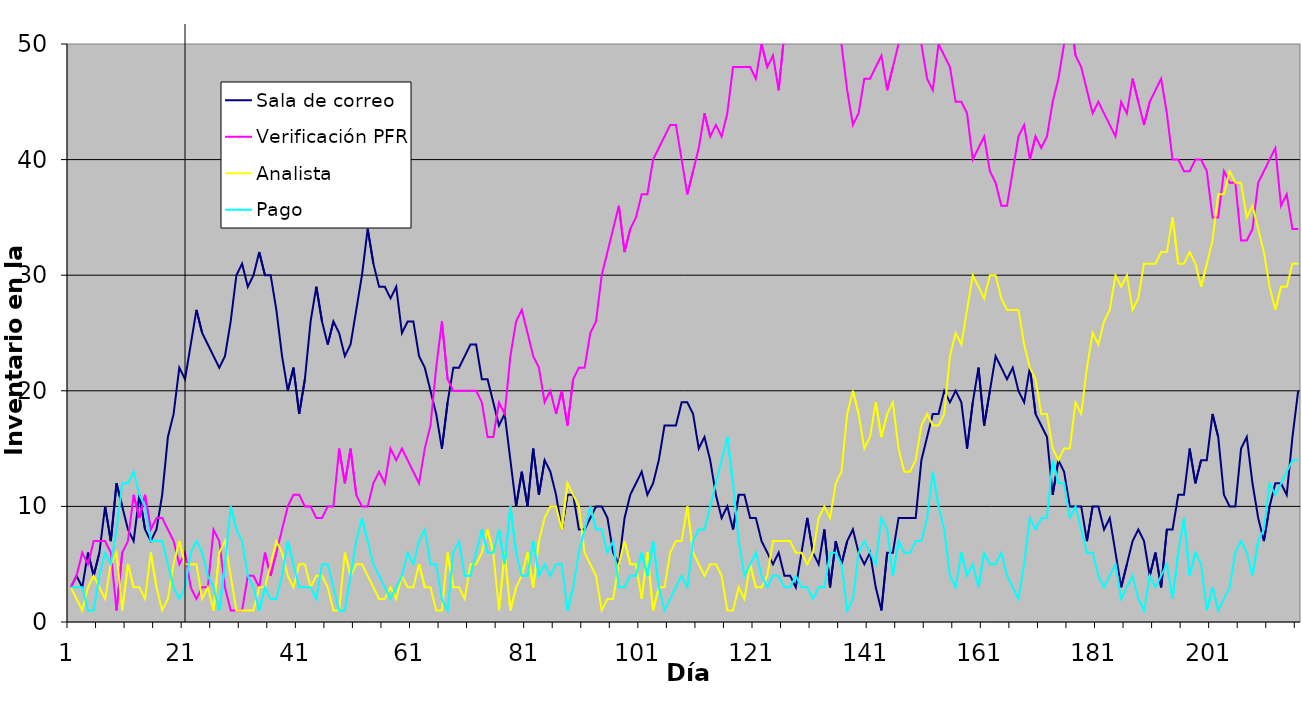
| Category | Sala de correo | Verificación PFR | Analista | Pago |
|---|---|---|---|---|
| 0 | 3 | 3 | 3 | 3 |
| 1 | 4 | 4 | 2 | 3 |
| 2 | 3 | 6 | 1 | 3 |
| 3 | 6 | 5 | 3 | 1 |
| 4 | 4 | 7 | 4 | 1 |
| 5 | 6 | 7 | 3 | 4 |
| 6 | 10 | 7 | 2 | 6 |
| 7 | 7 | 6 | 5 | 5 |
| 8 | 12 | 1 | 6 | 8 |
| 9 | 10 | 6 | 1 | 12 |
| 10 | 8 | 7 | 5 | 12 |
| 11 | 7 | 11 | 3 | 13 |
| 12 | 11 | 9 | 3 | 11 |
| 13 | 8 | 11 | 2 | 10 |
| 14 | 7 | 8 | 6 | 7 |
| 15 | 8 | 9 | 3 | 7 |
| 16 | 11 | 9 | 1 | 7 |
| 17 | 16 | 8 | 2 | 5 |
| 18 | 18 | 7 | 5 | 3 |
| 19 | 22 | 5 | 7 | 2 |
| 20 | 21 | 6 | 5 | 3 |
| 21 | 24 | 3 | 5 | 6 |
| 22 | 27 | 2 | 5 | 7 |
| 23 | 25 | 3 | 2 | 6 |
| 24 | 24 | 3 | 3 | 4 |
| 25 | 23 | 8 | 1 | 3 |
| 26 | 22 | 7 | 6 | 1 |
| 27 | 23 | 3 | 7 | 5 |
| 28 | 26 | 1 | 4 | 10 |
| 29 | 30 | 1 | 1 | 8 |
| 30 | 31 | 1 | 1 | 7 |
| 31 | 29 | 4 | 1 | 4 |
| 32 | 30 | 4 | 1 | 3 |
| 33 | 32 | 3 | 3 | 1 |
| 34 | 30 | 6 | 3 | 3 |
| 35 | 30 | 4 | 5 | 2 |
| 36 | 27 | 6 | 7 | 2 |
| 37 | 23 | 8 | 6 | 4 |
| 38 | 20 | 10 | 4 | 7 |
| 39 | 22 | 11 | 3 | 5 |
| 40 | 18 | 11 | 5 | 3 |
| 41 | 21 | 10 | 5 | 3 |
| 42 | 26 | 10 | 3 | 3 |
| 43 | 29 | 9 | 4 | 2 |
| 44 | 26 | 9 | 4 | 5 |
| 45 | 24 | 10 | 3 | 5 |
| 46 | 26 | 10 | 1 | 3 |
| 47 | 25 | 15 | 1 | 1 |
| 48 | 23 | 12 | 6 | 1 |
| 49 | 24 | 15 | 4 | 4 |
| 50 | 27 | 11 | 5 | 7 |
| 51 | 30 | 10 | 5 | 9 |
| 52 | 34 | 10 | 4 | 7 |
| 53 | 31 | 12 | 3 | 5 |
| 54 | 29 | 13 | 2 | 4 |
| 55 | 29 | 12 | 2 | 3 |
| 56 | 28 | 15 | 3 | 2 |
| 57 | 29 | 14 | 2 | 3 |
| 58 | 25 | 15 | 4 | 4 |
| 59 | 26 | 14 | 3 | 6 |
| 60 | 26 | 13 | 3 | 5 |
| 61 | 23 | 12 | 5 | 7 |
| 62 | 22 | 15 | 3 | 8 |
| 63 | 20 | 17 | 3 | 5 |
| 64 | 18 | 22 | 1 | 5 |
| 65 | 15 | 26 | 1 | 2 |
| 66 | 19 | 21 | 6 | 1 |
| 67 | 22 | 20 | 3 | 6 |
| 68 | 22 | 20 | 3 | 7 |
| 69 | 23 | 20 | 2 | 4 |
| 70 | 24 | 20 | 5 | 4 |
| 71 | 24 | 20 | 5 | 6 |
| 72 | 21 | 19 | 6 | 8 |
| 73 | 21 | 16 | 8 | 6 |
| 74 | 19 | 16 | 6 | 6 |
| 75 | 17 | 19 | 1 | 8 |
| 76 | 18 | 18 | 6 | 5 |
| 77 | 14 | 23 | 1 | 10 |
| 78 | 10 | 26 | 3 | 6 |
| 79 | 13 | 27 | 4 | 4 |
| 80 | 10 | 25 | 6 | 4 |
| 81 | 15 | 23 | 3 | 7 |
| 82 | 11 | 22 | 7 | 4 |
| 83 | 14 | 19 | 9 | 5 |
| 84 | 13 | 20 | 10 | 4 |
| 85 | 11 | 18 | 10 | 5 |
| 86 | 8 | 20 | 8 | 5 |
| 87 | 11 | 17 | 12 | 1 |
| 88 | 11 | 21 | 11 | 3 |
| 89 | 8 | 22 | 10 | 6 |
| 90 | 8 | 22 | 6 | 8 |
| 91 | 9 | 25 | 5 | 10 |
| 92 | 10 | 26 | 4 | 8 |
| 93 | 10 | 30 | 1 | 8 |
| 94 | 9 | 32 | 2 | 6 |
| 95 | 6 | 34 | 2 | 7 |
| 96 | 5 | 36 | 5 | 3 |
| 97 | 9 | 32 | 7 | 3 |
| 98 | 11 | 34 | 5 | 4 |
| 99 | 12 | 35 | 5 | 4 |
| 100 | 13 | 37 | 2 | 6 |
| 101 | 11 | 37 | 6 | 4 |
| 102 | 12 | 40 | 1 | 7 |
| 103 | 14 | 41 | 3 | 3 |
| 104 | 17 | 42 | 3 | 1 |
| 105 | 17 | 43 | 6 | 2 |
| 106 | 17 | 43 | 7 | 3 |
| 107 | 19 | 40 | 7 | 4 |
| 108 | 19 | 37 | 10 | 3 |
| 109 | 18 | 39 | 6 | 7 |
| 110 | 15 | 41 | 5 | 8 |
| 111 | 16 | 44 | 4 | 8 |
| 112 | 14 | 42 | 5 | 10 |
| 113 | 11 | 43 | 5 | 12 |
| 114 | 9 | 42 | 4 | 14 |
| 115 | 10 | 44 | 1 | 16 |
| 116 | 8 | 48 | 1 | 12 |
| 117 | 11 | 48 | 3 | 7 |
| 118 | 11 | 48 | 2 | 4 |
| 119 | 9 | 48 | 5 | 5 |
| 120 | 9 | 47 | 3 | 6 |
| 121 | 7 | 50 | 3 | 4 |
| 122 | 6 | 48 | 4 | 3 |
| 123 | 5 | 49 | 7 | 4 |
| 124 | 6 | 46 | 7 | 4 |
| 125 | 4 | 51 | 7 | 3 |
| 126 | 4 | 52 | 7 | 3 |
| 127 | 3 | 55 | 6 | 4 |
| 128 | 6 | 55 | 6 | 3 |
| 129 | 9 | 55 | 5 | 3 |
| 130 | 6 | 56 | 6 | 2 |
| 131 | 5 | 55 | 9 | 3 |
| 132 | 8 | 53 | 10 | 3 |
| 133 | 3 | 54 | 9 | 6 |
| 134 | 7 | 51 | 12 | 6 |
| 135 | 5 | 50 | 13 | 5 |
| 136 | 7 | 46 | 18 | 1 |
| 137 | 8 | 43 | 20 | 2 |
| 138 | 6 | 44 | 18 | 6 |
| 139 | 5 | 47 | 15 | 7 |
| 140 | 6 | 47 | 16 | 6 |
| 141 | 3 | 48 | 19 | 5 |
| 142 | 1 | 49 | 16 | 9 |
| 143 | 6 | 46 | 18 | 8 |
| 144 | 6 | 48 | 19 | 4 |
| 145 | 9 | 50 | 15 | 7 |
| 146 | 9 | 52 | 13 | 6 |
| 147 | 9 | 54 | 13 | 6 |
| 148 | 9 | 55 | 14 | 7 |
| 149 | 14 | 50 | 17 | 7 |
| 150 | 16 | 47 | 18 | 9 |
| 151 | 18 | 46 | 17 | 13 |
| 152 | 18 | 50 | 17 | 10 |
| 153 | 20 | 49 | 18 | 8 |
| 154 | 19 | 48 | 23 | 4 |
| 155 | 20 | 45 | 25 | 3 |
| 156 | 19 | 45 | 24 | 6 |
| 157 | 15 | 44 | 27 | 4 |
| 158 | 19 | 40 | 30 | 5 |
| 159 | 22 | 41 | 29 | 3 |
| 160 | 17 | 42 | 28 | 6 |
| 161 | 20 | 39 | 30 | 5 |
| 162 | 23 | 38 | 30 | 5 |
| 163 | 22 | 36 | 28 | 6 |
| 164 | 21 | 36 | 27 | 4 |
| 165 | 22 | 39 | 27 | 3 |
| 166 | 20 | 42 | 27 | 2 |
| 167 | 19 | 43 | 24 | 5 |
| 168 | 22 | 40 | 22 | 9 |
| 169 | 18 | 42 | 21 | 8 |
| 170 | 17 | 41 | 18 | 9 |
| 171 | 16 | 42 | 18 | 9 |
| 172 | 11 | 45 | 15 | 14 |
| 173 | 14 | 47 | 14 | 12 |
| 174 | 13 | 50 | 15 | 12 |
| 175 | 10 | 53 | 15 | 9 |
| 176 | 10 | 49 | 19 | 10 |
| 177 | 10 | 48 | 18 | 8 |
| 178 | 7 | 46 | 22 | 6 |
| 179 | 10 | 44 | 25 | 6 |
| 180 | 10 | 45 | 24 | 4 |
| 181 | 8 | 44 | 26 | 3 |
| 182 | 9 | 43 | 27 | 4 |
| 183 | 6 | 42 | 30 | 5 |
| 184 | 3 | 45 | 29 | 2 |
| 185 | 5 | 44 | 30 | 3 |
| 186 | 7 | 47 | 27 | 4 |
| 187 | 8 | 45 | 28 | 2 |
| 188 | 7 | 43 | 31 | 1 |
| 189 | 4 | 45 | 31 | 4 |
| 190 | 6 | 46 | 31 | 3 |
| 191 | 3 | 47 | 32 | 4 |
| 192 | 8 | 44 | 32 | 5 |
| 193 | 8 | 40 | 35 | 2 |
| 194 | 11 | 40 | 31 | 6 |
| 195 | 11 | 39 | 31 | 9 |
| 196 | 15 | 39 | 32 | 4 |
| 197 | 12 | 40 | 31 | 6 |
| 198 | 14 | 40 | 29 | 5 |
| 199 | 14 | 39 | 31 | 1 |
| 200 | 18 | 35 | 33 | 3 |
| 201 | 16 | 35 | 37 | 1 |
| 202 | 11 | 39 | 37 | 2 |
| 203 | 10 | 38 | 39 | 3 |
| 204 | 10 | 38 | 38 | 6 |
| 205 | 15 | 33 | 38 | 7 |
| 206 | 16 | 33 | 35 | 6 |
| 207 | 12 | 34 | 36 | 4 |
| 208 | 9 | 38 | 34 | 7 |
| 209 | 7 | 39 | 32 | 8 |
| 210 | 10 | 40 | 29 | 12 |
| 211 | 12 | 41 | 27 | 11 |
| 212 | 12 | 36 | 29 | 12 |
| 213 | 11 | 37 | 29 | 13 |
| 214 | 16 | 34 | 31 | 14 |
| 215 | 20 | 34 | 31 | 14 |